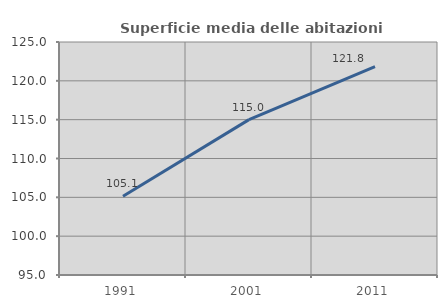
| Category | Superficie media delle abitazioni occupate |
|---|---|
| 1991.0 | 105.131 |
| 2001.0 | 115.002 |
| 2011.0 | 121.836 |